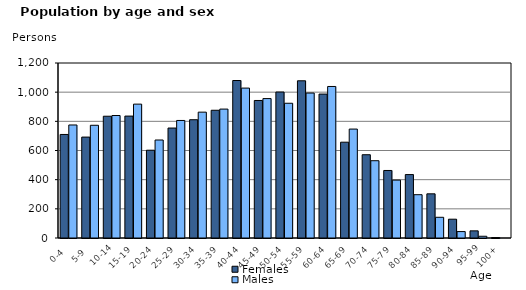
| Category | Females | Males |
|---|---|---|
|   0-4  | 710 | 775 |
|   5-9  | 692 | 773 |
| 10-14 | 835 | 840 |
| 15-19  | 836 | 918 |
| 20-24  | 602 | 672 |
| 25-29  | 754 | 806 |
| 30-34  | 811 | 863 |
| 35-39  | 876 | 884 |
| 40-44  | 1080 | 1028 |
| 45-49  | 943 | 956 |
| 50-54  | 1001 | 924 |
| 55-59  | 1078 | 994 |
| 60-64  | 987 | 1039 |
| 65-69  | 657 | 747 |
| 70-74  | 571 | 530 |
| 75-79  | 463 | 397 |
| 80-84  | 435 | 297 |
| 85-89  | 303 | 142 |
| 90-94  | 129 | 44 |
| 95-99 | 49 | 12 |
| 100+ | 3 | 0 |